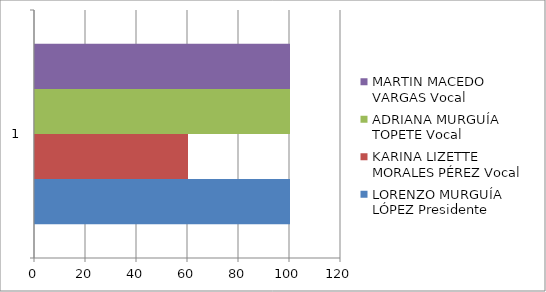
| Category | LORENZO MURGUÍA LÓPEZ Presidente | KARINA LIZETTE MORALES PÉREZ Vocal | ADRIANA MURGUÍA TOPETE Vocal | MARTIN MACEDO VARGAS Vocal |
|---|---|---|---|---|
| 0 | 100 | 60 | 100 | 100 |